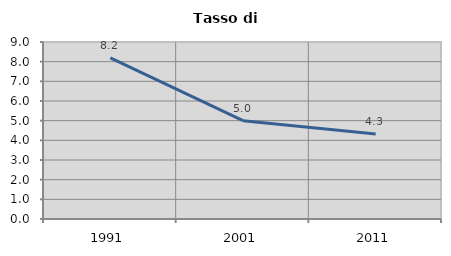
| Category | Tasso di disoccupazione   |
|---|---|
| 1991.0 | 8.19 |
| 2001.0 | 5 |
| 2011.0 | 4.324 |